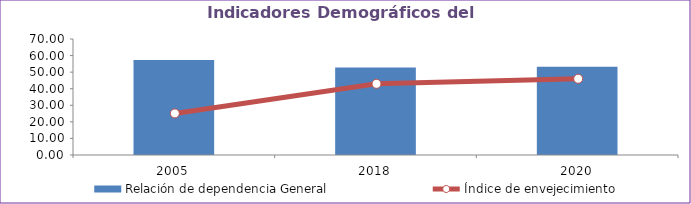
| Category | Relación de dependencia General |
|---|---|
| 2005.0 | 57.401 |
| 2018.0 | 52.783 |
| 2020.0 | 53.324 |